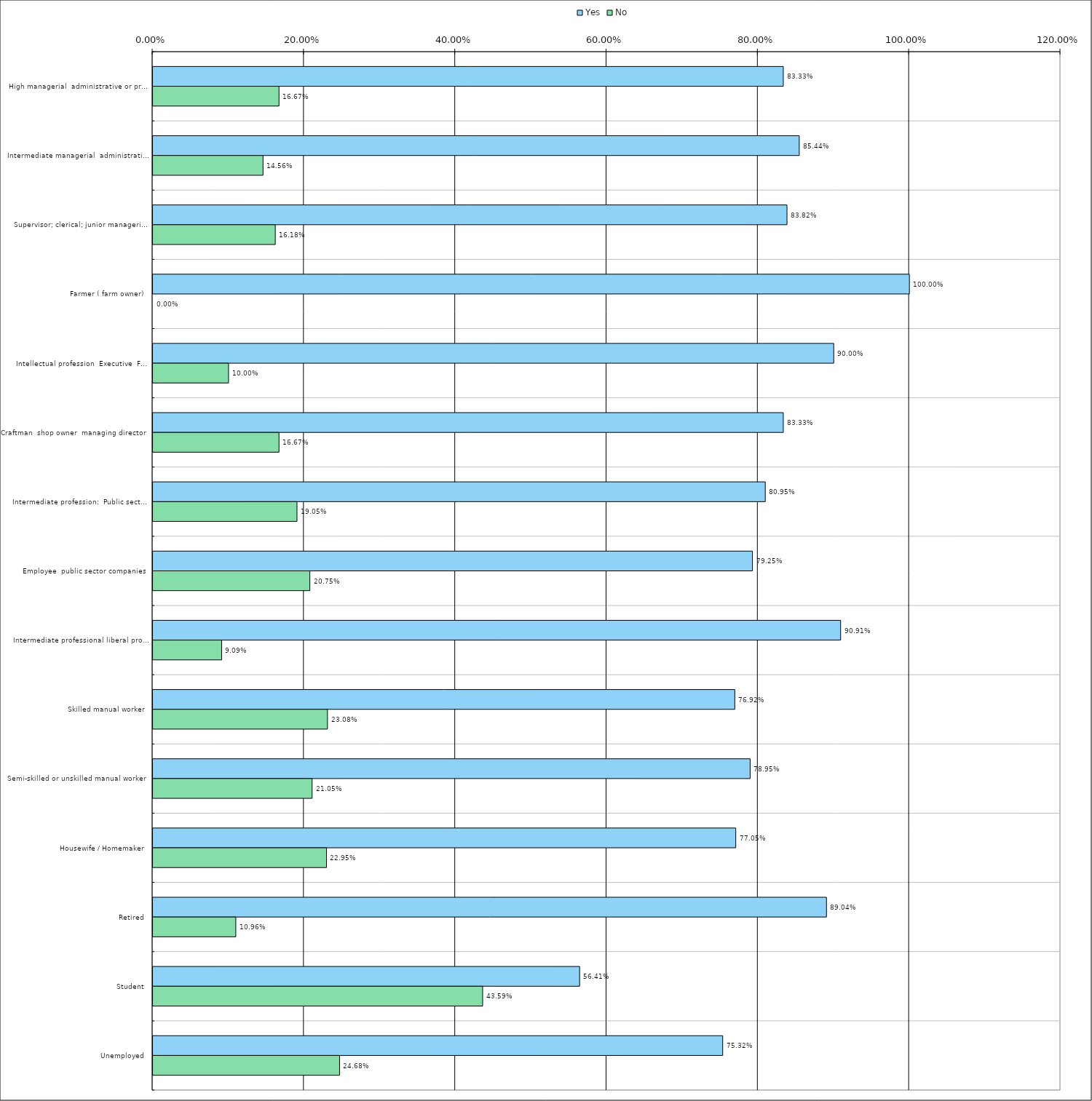
| Category | Yes | No |
|---|---|---|
| 0 | 0.833 | 0.167 |
| 1 | 0.854 | 0.146 |
| 2 | 0.838 | 0.162 |
| 3 | 1 | 0 |
| 4 | 0.9 | 0.1 |
| 5 | 0.833 | 0.167 |
| 6 | 0.81 | 0.19 |
| 7 | 0.792 | 0.208 |
| 8 | 0.909 | 0.091 |
| 9 | 0.769 | 0.231 |
| 10 | 0.79 | 0.21 |
| 11 | 0.77 | 0.23 |
| 12 | 0.89 | 0.11 |
| 13 | 0.564 | 0.436 |
| 14 | 0.753 | 0.247 |